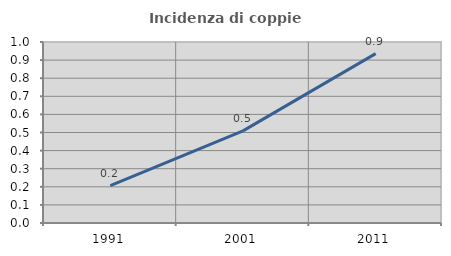
| Category | Incidenza di coppie miste |
|---|---|
| 1991.0 | 0.206 |
| 2001.0 | 0.509 |
| 2011.0 | 0.936 |